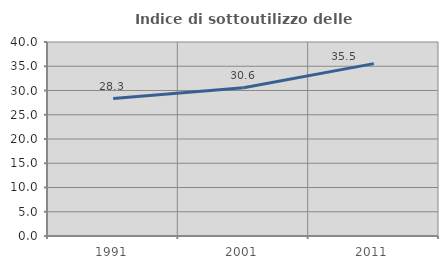
| Category | Indice di sottoutilizzo delle abitazioni  |
|---|---|
| 1991.0 | 28.333 |
| 2001.0 | 30.566 |
| 2011.0 | 35.537 |